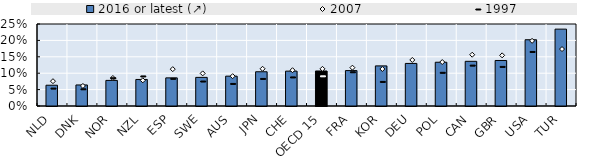
| Category | 2016 or latest (↗) |
|---|---|
| NLD | 0.063 |
| DNK | 0.064 |
| NOR | 0.078 |
| NZL | 0.081 |
| ESP | 0.086 |
| SWE | 0.087 |
| AUS | 0.091 |
| JPN | 0.104 |
| CHE | 0.106 |
| OECD 15 | 0.107 |
| FRA | 0.108 |
| KOR | 0.122 |
| DEU | 0.13 |
| POL | 0.133 |
| CAN | 0.136 |
| GBR | 0.139 |
| USA | 0.202 |
| TUR | 0.234 |